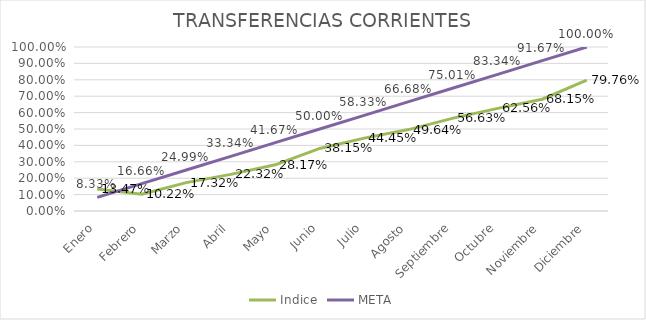
| Category | Indice | META |
|---|---|---|
| Enero | 0.135 | 0.083 |
| Febrero | 0.102 | 0.167 |
| Marzo | 0.173 | 0.25 |
| Abril | 0.223 | 0.333 |
| Mayo | 0.282 | 0.417 |
| Junio | 0.382 | 0.5 |
| Julio | 0.444 | 0.583 |
| Agosto | 0.496 | 0.667 |
| Septiembre | 0.566 | 0.75 |
| Octubre | 0.626 | 0.833 |
| Noviembre | 0.682 | 0.917 |
| Diciembre | 0.798 | 1 |